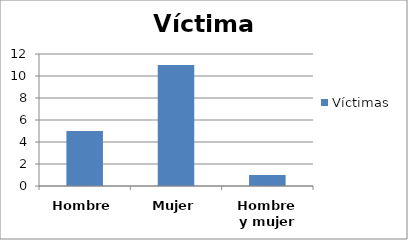
| Category | Víctimas |
|---|---|
| Hombre | 5 |
| Mujer | 11 |
| Hombre y mujer | 1 |